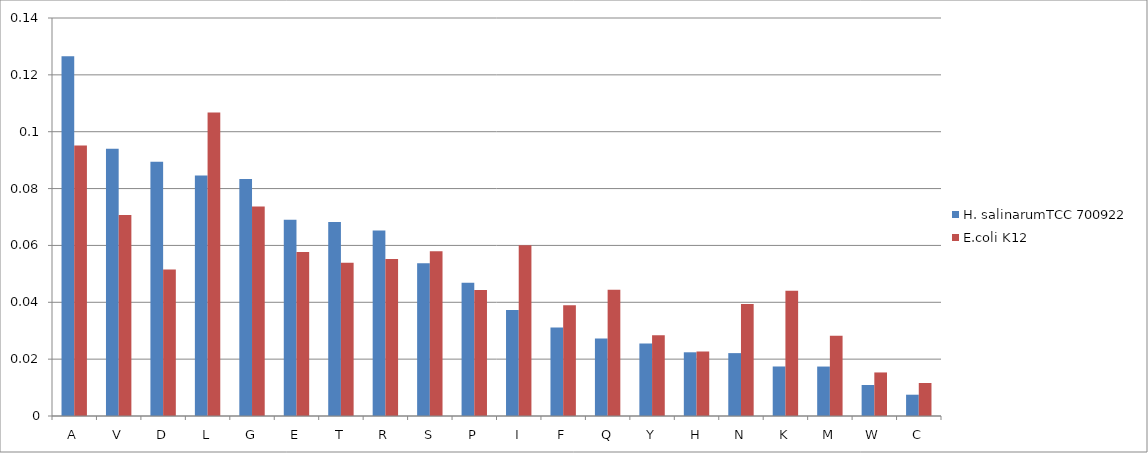
| Category | H. salinarumTCC 700922 | E.coli K12 |
|---|---|---|
| A | 0.127 | 0.095 |
| V | 0.094 | 0.071 |
| D | 0.089 | 0.051 |
| L | 0.085 | 0.107 |
| G | 0.083 | 0.074 |
| E | 0.069 | 0.058 |
| T | 0.068 | 0.054 |
| R | 0.065 | 0.055 |
| S | 0.054 | 0.058 |
| P | 0.047 | 0.044 |
| I | 0.037 | 0.06 |
| F | 0.031 | 0.039 |
| Q | 0.027 | 0.044 |
| Y | 0.026 | 0.028 |
| H | 0.022 | 0.023 |
| N | 0.022 | 0.039 |
| K | 0.017 | 0.044 |
| M | 0.017 | 0.028 |
| W | 0.011 | 0.015 |
| C | 0.007 | 0.012 |